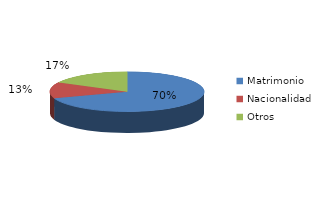
| Category | Series 0 |
|---|---|
| Matrimonio | 1228 |
| Nacionalidad | 233 |
| Otros | 305 |